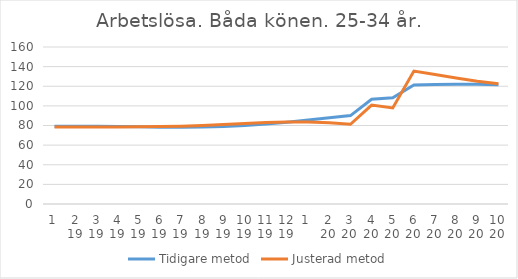
| Category | Tidigare metod | Justerad metod |
|---|---|---|
| 0 | 79.29 | 78.59 |
| 1 | 79.35 | 78.55 |
| 2 | 79.25 | 78.55 |
| 3 | 78.98 | 78.59 |
| 4 | 78.63 | 78.7 |
| 5 | 78.34 | 78.93 |
| 6 | 78.19 | 79.36 |
| 7 | 78.36 | 80.06 |
| 8 | 78.95 | 81.02 |
| 9 | 80.02 | 82.07 |
| 10 | 81.52 | 82.96 |
| 11 | 83.42 | 83.5 |
| 12 | 85.62 | 83.49 |
| 13 | 87.92 | 82.78 |
| 14 | 90.09 | 81.23 |
| 15 | 106.81 | 100.79 |
| 16 | 108.33 | 97.84 |
| 17 | 121.27 | 135.5 |
| 18 | 121.91 | 131.93 |
| 19 | 122.09 | 128.38 |
| 20 | 121.93 | 125.15 |
| 21 | 121.55 | 122.45 |